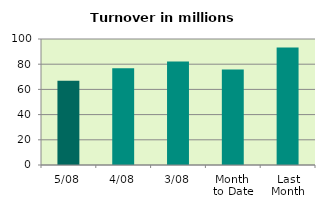
| Category | Series 0 |
|---|---|
| 5/08 | 66.925 |
| 4/08 | 76.879 |
| 3/08 | 82.053 |
| Month 
to Date | 75.756 |
| Last
Month | 93.279 |